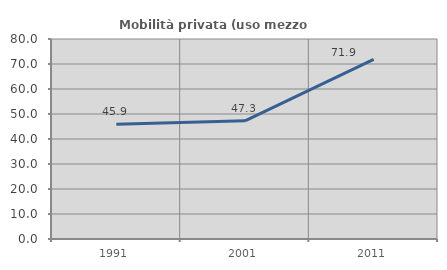
| Category | Mobilità privata (uso mezzo privato) |
|---|---|
| 1991.0 | 45.946 |
| 2001.0 | 47.273 |
| 2011.0 | 71.875 |